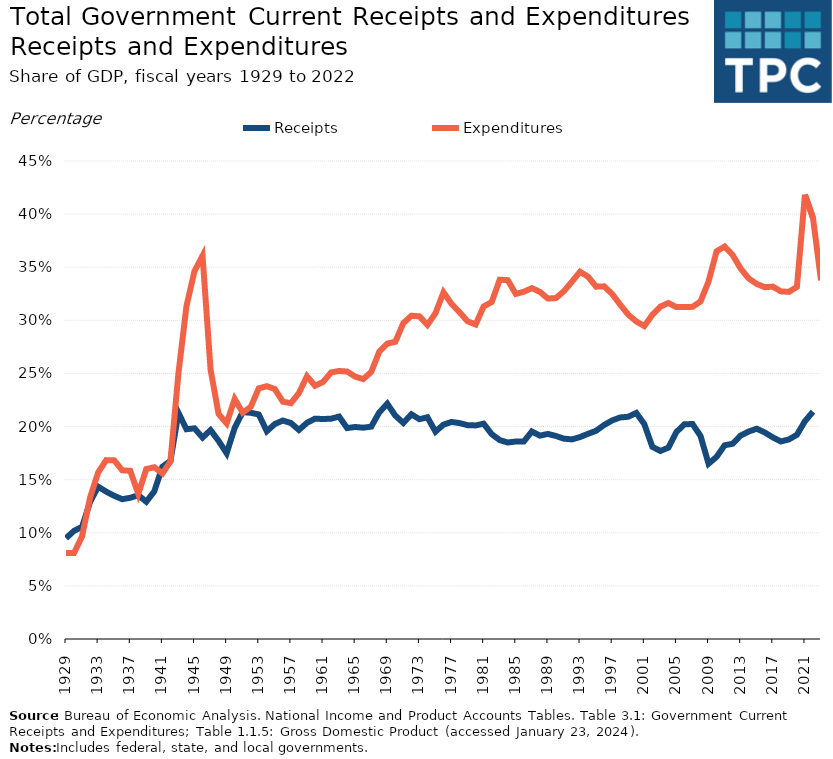
| Category |    Receipts |    Expenditures |
|---|---|---|
| 1929.0 | 0.095 | 0.081 |
| 1930.0 | 0.102 | 0.081 |
| 1931.0 | 0.106 | 0.097 |
| 1932.0 | 0.129 | 0.133 |
| 1933.0 | 0.143 | 0.157 |
| 1934.0 | 0.139 | 0.168 |
| 1935.0 | 0.135 | 0.168 |
| 1936.0 | 0.132 | 0.159 |
| 1937.0 | 0.133 | 0.158 |
| 1938.0 | 0.135 | 0.137 |
| 1939.0 | 0.129 | 0.16 |
| 1940.0 | 0.139 | 0.162 |
| 1941.0 | 0.162 | 0.156 |
| 1942.0 | 0.168 | 0.167 |
| 1943.0 | 0.213 | 0.25 |
| 1944.0 | 0.197 | 0.313 |
| 1945.0 | 0.198 | 0.346 |
| 1946.0 | 0.19 | 0.361 |
| 1947.0 | 0.197 | 0.253 |
| 1948.0 | 0.186 | 0.212 |
| 1949.0 | 0.175 | 0.203 |
| 1950.0 | 0.199 | 0.226 |
| 1951.0 | 0.214 | 0.213 |
| 1952.0 | 0.213 | 0.219 |
| 1953.0 | 0.211 | 0.236 |
| 1954.0 | 0.196 | 0.238 |
| 1955.0 | 0.202 | 0.235 |
| 1956.0 | 0.206 | 0.223 |
| 1957.0 | 0.203 | 0.222 |
| 1958.0 | 0.197 | 0.232 |
| 1959.0 | 0.204 | 0.247 |
| 1960.0 | 0.207 | 0.238 |
| 1961.0 | 0.207 | 0.242 |
| 1962.0 | 0.207 | 0.251 |
| 1963.0 | 0.209 | 0.252 |
| 1964.0 | 0.199 | 0.252 |
| 1965.0 | 0.2 | 0.247 |
| 1966.0 | 0.199 | 0.245 |
| 1967.0 | 0.2 | 0.251 |
| 1968.0 | 0.213 | 0.27 |
| 1969.0 | 0.222 | 0.278 |
| 1970.0 | 0.21 | 0.28 |
| 1971.0 | 0.203 | 0.297 |
| 1972.0 | 0.212 | 0.304 |
| 1973.0 | 0.207 | 0.304 |
| 1974.0 | 0.209 | 0.296 |
| 1975.0 | 0.195 | 0.307 |
| 1976.0 | 0.202 | 0.326 |
| 1977.0 | 0.204 | 0.315 |
| 1978.0 | 0.203 | 0.308 |
| 1979.0 | 0.201 | 0.299 |
| 1980.0 | 0.201 | 0.296 |
| 1981.0 | 0.203 | 0.313 |
| 1982.0 | 0.193 | 0.317 |
| 1983.0 | 0.187 | 0.338 |
| 1984.0 | 0.185 | 0.338 |
| 1985.0 | 0.186 | 0.325 |
| 1986.0 | 0.186 | 0.327 |
| 1987.0 | 0.195 | 0.33 |
| 1988.0 | 0.191 | 0.327 |
| 1989.0 | 0.193 | 0.321 |
| 1990.0 | 0.191 | 0.321 |
| 1991.0 | 0.189 | 0.327 |
| 1992.0 | 0.188 | 0.336 |
| 1993.0 | 0.19 | 0.346 |
| 1994.0 | 0.193 | 0.341 |
| 1995.0 | 0.196 | 0.332 |
| 1996.0 | 0.201 | 0.332 |
| 1997.0 | 0.206 | 0.325 |
| 1998.0 | 0.209 | 0.315 |
| 1999.0 | 0.209 | 0.305 |
| 2000.0 | 0.213 | 0.299 |
| 2001.0 | 0.202 | 0.295 |
| 2002.0 | 0.181 | 0.305 |
| 2003.0 | 0.177 | 0.313 |
| 2004.0 | 0.18 | 0.316 |
| 2005.0 | 0.195 | 0.312 |
| 2006.0 | 0.202 | 0.313 |
| 2007.0 | 0.202 | 0.313 |
| 2008.0 | 0.191 | 0.318 |
| 2009.0 | 0.165 | 0.337 |
| 2010.0 | 0.171 | 0.365 |
| 2011.0 | 0.182 | 0.369 |
| 2012.0 | 0.184 | 0.362 |
| 2013.0 | 0.192 | 0.349 |
| 2014.0 | 0.195 | 0.339 |
| 2015.0 | 0.198 | 0.334 |
| 2016.0 | 0.194 | 0.331 |
| 2017.0 | 0.19 | 0.332 |
| 2018.0 | 0.186 | 0.327 |
| 2019.0 | 0.188 | 0.327 |
| 2020.0 | 0.192 | 0.331 |
| 2021.0 | 0.205 | 0.418 |
| 2022.0 | 0.214 | 0.396 |